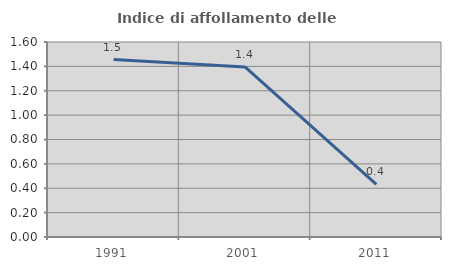
| Category | Indice di affollamento delle abitazioni  |
|---|---|
| 1991.0 | 1.456 |
| 2001.0 | 1.395 |
| 2011.0 | 0.431 |